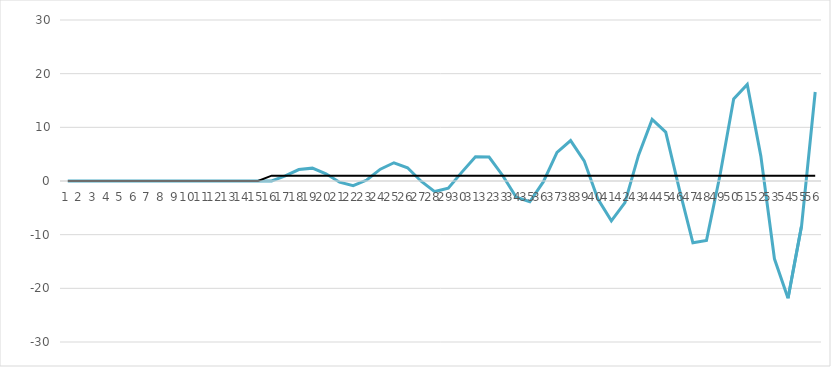
| Category | 5) | Series 5 |
|---|---|---|
| 0 | 0 | 0 |
| 1 | 0 | 0 |
| 2 | 0 | 0 |
| 3 | 0 | 0 |
| 4 | 0 | 0 |
| 5 | 0 | 0 |
| 6 | 0 | 0 |
| 7 | 0 | 0 |
| 8 | 0 | 0 |
| 9 | 0 | 0 |
| 10 | 0 | 0 |
| 11 | 0 | 0 |
| 12 | 0 | 0 |
| 13 | 0 | 0 |
| 14 | 0 | 0 |
| 15 | 0 | 1 |
| 16 | 0.97 | 1 |
| 17 | 2.134 | 1 |
| 18 | 2.396 | 1 |
| 19 | 1.348 | 1 |
| 20 | -0.215 | 1 |
| 21 | -0.866 | 1 |
| 22 | 0.183 | 1 |
| 23 | 2.202 | 1 |
| 24 | 3.399 | 1 |
| 25 | 2.472 | 1 |
| 26 | -0.04 | 1 |
| 27 | -1.971 | 1 |
| 28 | -1.347 | 1 |
| 29 | 1.659 | 1 |
| 30 | 4.537 | 1 |
| 31 | 4.474 | 1 |
| 32 | 1.03 | 1 |
| 33 | -3.028 | 1 |
| 34 | -3.869 | 1 |
| 35 | -0.13 | 1 |
| 36 | 5.341 | 1 |
| 37 | 7.531 | 1 |
| 38 | 3.758 | 1 |
| 39 | -3.331 | 1 |
| 40 | -7.425 | 1 |
| 41 | -4.042 | 1 |
| 42 | 4.806 | 1 |
| 43 | 11.467 | 1 |
| 44 | 9.107 | 1 |
| 45 | -1.518 | 1 |
| 46 | -11.507 | 1 |
| 47 | -11.062 | 1 |
| 48 | 1.158 | 1 |
| 49 | 15.303 | 1 |
| 50 | 17.978 | 1 |
| 51 | 4.639 | 1 |
| 52 | -14.497 | 1 |
| 53 | -21.854 | 1 |
| 54 | -8.294 | 1 |
| 55 | 16.587 | 1 |